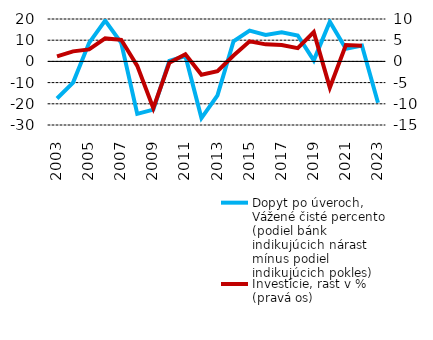
| Category | Dopyt po úveroch, Vážené čisté percento (podiel bánk indikujúcich nárast mínus podiel indikujúcich pokles) |
|---|---|
| 2003.0 | -17.5 |
| 2004.0 | -10 |
| 2005.0 | 8.75 |
| 2006.0 | 19.25 |
| 2007.0 | 8.75 |
| 2008.0 | -24.75 |
| 2009.0 | -22.75 |
| 2010.0 | 0.25 |
| 2011.0 | 2.5 |
| 2012.0 | -26.75 |
| 2013.0 | -16 |
| 2014.0 | 9.5 |
| 2015.0 | 14.5 |
| 2016.0 | 12.5 |
| 2017.0 | 13.75 |
| 2018.0 | 12.25 |
| 2019.0 | 0.5 |
| 2020.0 | 18.75 |
| 2021.0 | 6 |
| 2022.0 | 7.5 |
| 2023.0 | -19.5 |